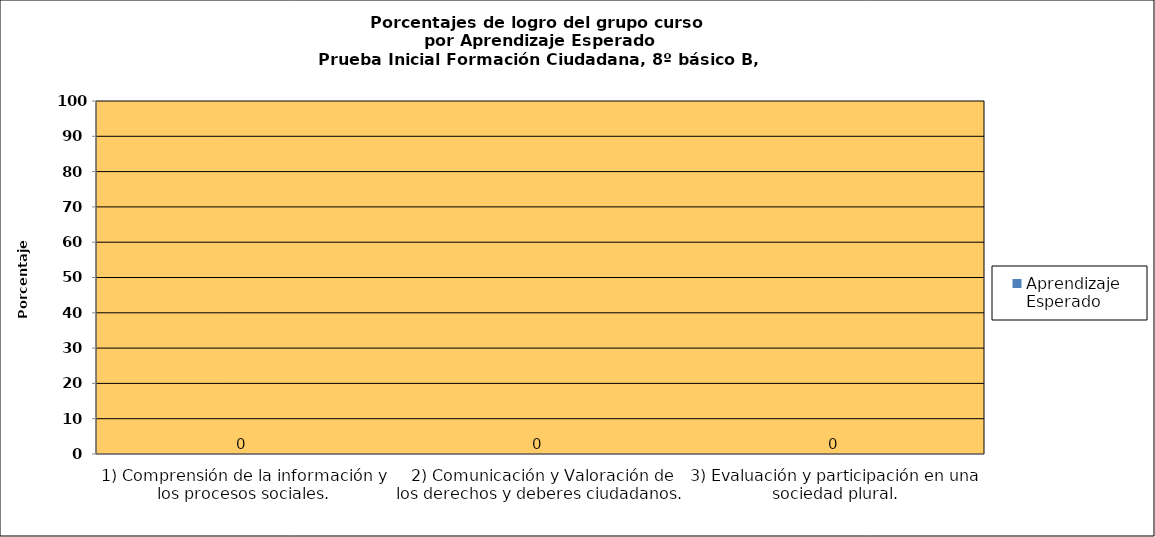
| Category | Aprendizaje Esperado |
|---|---|
| 1) Comprensión de la información y los procesos sociales. | 0 |
|  2) Comunicación y Valoración de los derechos y deberes ciudadanos. | 0 |
| 3) Evaluación y participación en una sociedad plural. | 0 |